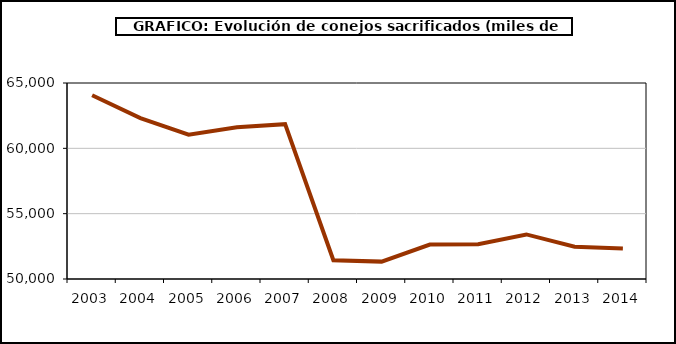
| Category | Peso canal |
|---|---|
| 2003.0 | 64060.308 |
| 2004.0 | 62317.056 |
| 2005.0 | 61048.849 |
| 2006.0 | 61617.92 |
| 2007.0 | 61847.888 |
| 2008.0 | 51435.256 |
| 2009.0 | 51329.996 |
| 2010.0 | 52633.291 |
| 2011.0 | 52667.903 |
| 2012.0 | 53411.014 |
| 2013.0 | 52470.38 |
| 2014.0 | 52326.841 |